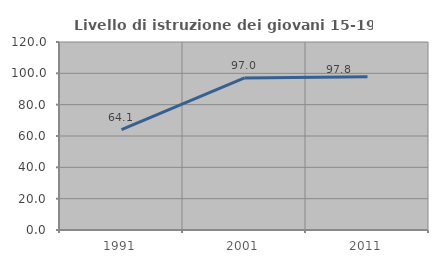
| Category | Livello di istruzione dei giovani 15-19 anni |
|---|---|
| 1991.0 | 64.062 |
| 2001.0 | 97.03 |
| 2011.0 | 97.753 |